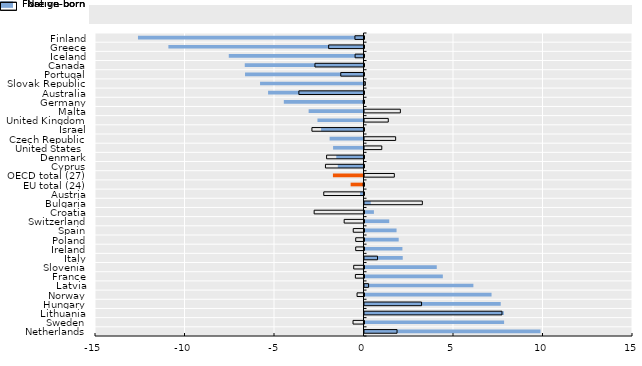
| Category | Foreign-born | Native-born |
|---|---|---|
| Netherlands | 9.831 | 1.818 |
| Sweden | 7.799 | -0.614 |
| Lithuania | 7.784 | 7.679 |
| Hungary | 7.611 | 3.187 |
| Norway | 7.097 | -0.388 |
| Latvia | 6.083 | 0.228 |
| France | 4.376 | -0.482 |
| Slovenia | 4.038 | -0.576 |
| Italy | 2.137 | 0.727 |
| Ireland | 2.118 | -0.464 |
| Poland | 1.91 | -0.463 |
| Spain | 1.791 | -0.601 |
| Switzerland | 1.382 | -1.108 |
| Croatia | 0.526 | -2.785 |
| Bulgaria | 0.347 | 3.232 |
| Austria | -0.192 | -2.248 |
| EU total (24) | -0.719 | -0.046 |
| OECD total (27) | -1.708 | 1.667 |
| Cyprus | -1.436 | -2.153 |
| Denmark | -1.521 | -2.09 |
| United States  | -1.7 | 0.966 |
| Czech Republic | -1.893 | 1.74 |
| Israel | -2.37 | -2.91 |
| United Kingdom | -2.572 | 1.328 |
| Malta | -3.065 | 2.004 |
| Germany | -4.451 | -0.047 |
| Australia | -5.331 | -3.639 |
| Slovak Republic | -5.78 | 0.049 |
| Portugal | -6.619 | -1.299 |
| Canada | -6.633 | -2.74 |
| Iceland | -7.526 | -0.497 |
| Greece | -10.9 | -1.975 |
| Finland | -12.599 | -0.508 |